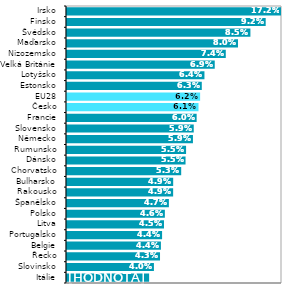
| Category | Series 0 |
|---|---|
| Itálie | 0.038 |
| Slovinsko | 0.04 |
| Řecko | 0.043 |
| Belgie | 0.044 |
| Portugalsko | 0.044 |
| Litva | 0.045 |
| Polsko | 0.046 |
| Španělsko | 0.047 |
| Rakousko | 0.049 |
| Bulharsko | 0.049 |
| Chorvatsko | 0.053 |
| Dánsko | 0.055 |
| Rumunsko | 0.055 |
| Německo | 0.059 |
| Slovensko | 0.059 |
| Francie | 0.06 |
| Česko | 0.061 |
| EU28 | 0.062 |
| Estonsko | 0.063 |
| Lotyšsko | 0.064 |
| Velká Británie | 0.069 |
| Nizozemsko | 0.074 |
| Maďarsko | 0.08 |
| Švédsko | 0.085 |
| Finsko | 0.092 |
| Irsko | 0.172 |